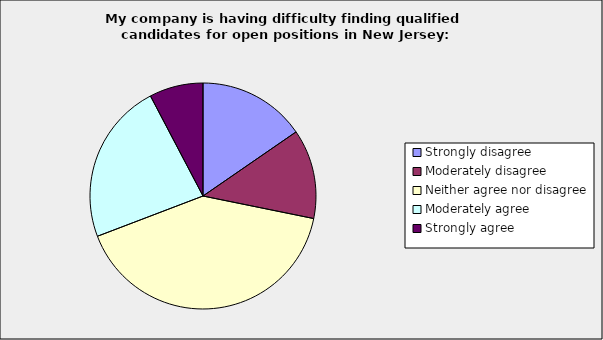
| Category | Series 0 |
|---|---|
| Strongly disagree | 0.154 |
| Moderately disagree | 0.128 |
| Neither agree nor disagree | 0.41 |
| Moderately agree | 0.231 |
| Strongly agree | 0.077 |